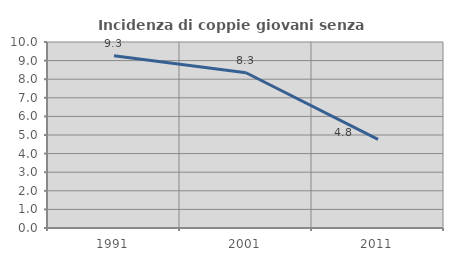
| Category | Incidenza di coppie giovani senza figli |
|---|---|
| 1991.0 | 9.265 |
| 2001.0 | 8.346 |
| 2011.0 | 4.766 |